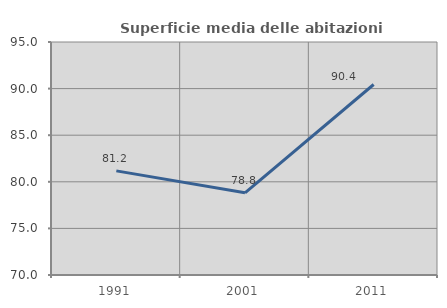
| Category | Superficie media delle abitazioni occupate |
|---|---|
| 1991.0 | 81.171 |
| 2001.0 | 78.822 |
| 2011.0 | 90.438 |